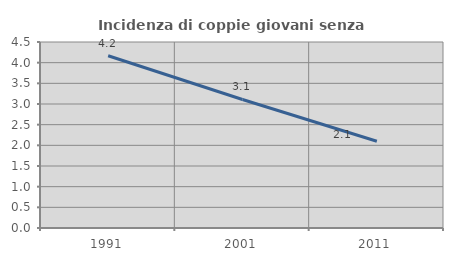
| Category | Incidenza di coppie giovani senza figli |
|---|---|
| 1991.0 | 4.168 |
| 2001.0 | 3.11 |
| 2011.0 | 2.099 |